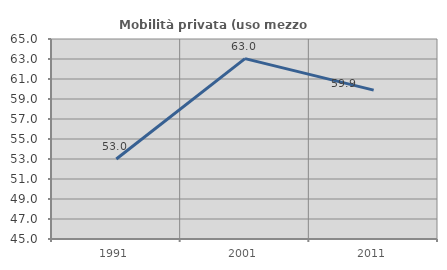
| Category | Mobilità privata (uso mezzo privato) |
|---|---|
| 1991.0 | 53 |
| 2001.0 | 63.036 |
| 2011.0 | 59.889 |